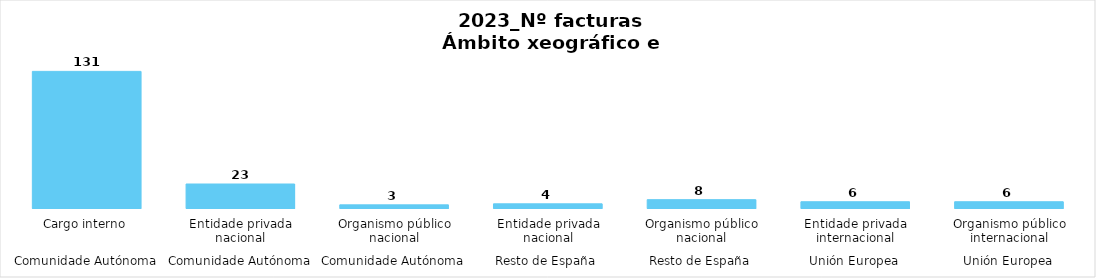
| Category | Series 0 |
|---|---|
| 0 | 131 |
| 1 | 23 |
| 2 | 3 |
| 3 | 4 |
| 4 | 8 |
| 5 | 6 |
| 6 | 6 |